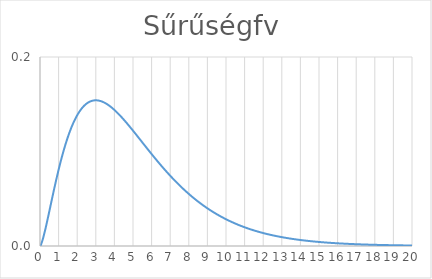
| Category | Series 0 |
|---|---|
| 0.0 | 0 |
| 0.01 | 0 |
| 0.02 | 0 |
| 0.03 | 0.001 |
| 0.04 | 0.001 |
| 0.05 | 0.001 |
| 0.06 | 0.002 |
| 0.07 | 0.002 |
| 0.08 | 0.003 |
| 0.09 | 0.003 |
| 0.1 | 0.004 |
| 0.11 | 0.005 |
| 0.12 | 0.005 |
| 0.13 | 0.006 |
| 0.14 | 0.006 |
| 0.15 | 0.007 |
| 0.16 | 0.008 |
| 0.17 | 0.009 |
| 0.18 | 0.009 |
| 0.19 | 0.01 |
| 0.2 | 0.011 |
| 0.21 | 0.012 |
| 0.22 | 0.012 |
| 0.23 | 0.013 |
| 0.24 | 0.014 |
| 0.25 | 0.015 |
| 0.26 | 0.015 |
| 0.27 | 0.016 |
| 0.28 | 0.017 |
| 0.29 | 0.018 |
| 0.3 | 0.019 |
| 0.31 | 0.02 |
| 0.32 | 0.021 |
| 0.33 | 0.021 |
| 0.34 | 0.022 |
| 0.35 | 0.023 |
| 0.36 | 0.024 |
| 0.37 | 0.025 |
| 0.38 | 0.026 |
| 0.39 | 0.027 |
| 0.4 | 0.028 |
| 0.41 | 0.028 |
| 0.42 | 0.029 |
| 0.43 | 0.03 |
| 0.44 | 0.031 |
| 0.45 | 0.032 |
| 0.46 | 0.033 |
| 0.47 | 0.034 |
| 0.48 | 0.035 |
| 0.49 | 0.036 |
| 0.5 | 0.037 |
| 0.51 | 0.038 |
| 0.52 | 0.038 |
| 0.53 | 0.039 |
| 0.54 | 0.04 |
| 0.55 | 0.041 |
| 0.56 | 0.042 |
| 0.57 | 0.043 |
| 0.58 | 0.044 |
| 0.59 | 0.045 |
| 0.6 | 0.046 |
| 0.61 | 0.047 |
| 0.62 | 0.048 |
| 0.63 | 0.049 |
| 0.64 | 0.049 |
| 0.65 | 0.05 |
| 0.66 | 0.051 |
| 0.67 | 0.052 |
| 0.68 | 0.053 |
| 0.69 | 0.054 |
| 0.7 | 0.055 |
| 0.71 | 0.056 |
| 0.72 | 0.057 |
| 0.73 | 0.058 |
| 0.74 | 0.058 |
| 0.75 | 0.059 |
| 0.76 | 0.06 |
| 0.77 | 0.061 |
| 0.78 | 0.062 |
| 0.79 | 0.063 |
| 0.8 | 0.064 |
| 0.81 | 0.065 |
| 0.82 | 0.066 |
| 0.83 | 0.066 |
| 0.84 | 0.067 |
| 0.85 | 0.068 |
| 0.86 | 0.069 |
| 0.87 | 0.07 |
| 0.88 | 0.071 |
| 0.89 | 0.072 |
| 0.9 | 0.072 |
| 0.91 | 0.073 |
| 0.92 | 0.074 |
| 0.93 | 0.075 |
| 0.94 | 0.076 |
| 0.95 | 0.077 |
| 0.96 | 0.077 |
| 0.97 | 0.078 |
| 0.98 | 0.079 |
| 0.99 | 0.08 |
| 1.0 | 0.081 |
| 1.01 | 0.081 |
| 1.02 | 0.082 |
| 1.03 | 0.083 |
| 1.04 | 0.084 |
| 1.05 | 0.085 |
| 1.06 | 0.085 |
| 1.07 | 0.086 |
| 1.08 | 0.087 |
| 1.09 | 0.088 |
| 1.1 | 0.089 |
| 1.11 | 0.089 |
| 1.12 | 0.09 |
| 1.13 | 0.091 |
| 1.14 | 0.092 |
| 1.15 | 0.092 |
| 1.16 | 0.093 |
| 1.17 | 0.094 |
| 1.18 | 0.094 |
| 1.19 | 0.095 |
| 1.2 | 0.096 |
| 1.21 | 0.097 |
| 1.22 | 0.097 |
| 1.23 | 0.098 |
| 1.24 | 0.099 |
| 1.25 | 0.099 |
| 1.26 | 0.1 |
| 1.27 | 0.101 |
| 1.28 | 0.102 |
| 1.29 | 0.102 |
| 1.3 | 0.103 |
| 1.31 | 0.104 |
| 1.32 | 0.104 |
| 1.33 | 0.105 |
| 1.34 | 0.106 |
| 1.35 | 0.106 |
| 1.36 | 0.107 |
| 1.37 | 0.107 |
| 1.38 | 0.108 |
| 1.39 | 0.109 |
| 1.4 | 0.109 |
| 1.41 | 0.11 |
| 1.42 | 0.111 |
| 1.43 | 0.111 |
| 1.44 | 0.112 |
| 1.45 | 0.112 |
| 1.46 | 0.113 |
| 1.47 | 0.114 |
| 1.48 | 0.114 |
| 1.49 | 0.115 |
| 1.5 | 0.115 |
| 1.51 | 0.116 |
| 1.52 | 0.117 |
| 1.53 | 0.117 |
| 1.54 | 0.118 |
| 1.55 | 0.118 |
| 1.56 | 0.119 |
| 1.57 | 0.119 |
| 1.58 | 0.12 |
| 1.59 | 0.12 |
| 1.6 | 0.121 |
| 1.61 | 0.121 |
| 1.62 | 0.122 |
| 1.63 | 0.122 |
| 1.64 | 0.123 |
| 1.65 | 0.124 |
| 1.66 | 0.124 |
| 1.67 | 0.125 |
| 1.68 | 0.125 |
| 1.69 | 0.125 |
| 1.7 | 0.126 |
| 1.71 | 0.126 |
| 1.72 | 0.127 |
| 1.73 | 0.127 |
| 1.74 | 0.128 |
| 1.75 | 0.128 |
| 1.76 | 0.129 |
| 1.77 | 0.129 |
| 1.78 | 0.13 |
| 1.79 | 0.13 |
| 1.8 | 0.131 |
| 1.81 | 0.131 |
| 1.82 | 0.131 |
| 1.83 | 0.132 |
| 1.84 | 0.132 |
| 1.85 | 0.133 |
| 1.86 | 0.133 |
| 1.87 | 0.134 |
| 1.88 | 0.134 |
| 1.89 | 0.134 |
| 1.9 | 0.135 |
| 1.91 | 0.135 |
| 1.92 | 0.135 |
| 1.93 | 0.136 |
| 1.94 | 0.136 |
| 1.95 | 0.137 |
| 1.96 | 0.137 |
| 1.97 | 0.137 |
| 1.98 | 0.138 |
| 1.99 | 0.138 |
| 2.0 | 0.138 |
| 2.01 | 0.139 |
| 2.02 | 0.139 |
| 2.03 | 0.139 |
| 2.04 | 0.14 |
| 2.05 | 0.14 |
| 2.06 | 0.14 |
| 2.07 | 0.141 |
| 2.08 | 0.141 |
| 2.09 | 0.141 |
| 2.1 | 0.142 |
| 2.11 | 0.142 |
| 2.12 | 0.142 |
| 2.13 | 0.143 |
| 2.14 | 0.143 |
| 2.15 | 0.143 |
| 2.16 | 0.143 |
| 2.17 | 0.144 |
| 2.18 | 0.144 |
| 2.19 | 0.144 |
| 2.2 | 0.144 |
| 2.21 | 0.145 |
| 2.22 | 0.145 |
| 2.23 | 0.145 |
| 2.24 | 0.145 |
| 2.25 | 0.146 |
| 2.26 | 0.146 |
| 2.27 | 0.146 |
| 2.28 | 0.146 |
| 2.29 | 0.147 |
| 2.3 | 0.147 |
| 2.31 | 0.147 |
| 2.32 | 0.147 |
| 2.33 | 0.148 |
| 2.34 | 0.148 |
| 2.35 | 0.148 |
| 2.36 | 0.148 |
| 2.37 | 0.148 |
| 2.38 | 0.149 |
| 2.39 | 0.149 |
| 2.4 | 0.149 |
| 2.41 | 0.149 |
| 2.42 | 0.149 |
| 2.43 | 0.149 |
| 2.44 | 0.15 |
| 2.45 | 0.15 |
| 2.46 | 0.15 |
| 2.47 | 0.15 |
| 2.48 | 0.15 |
| 2.49 | 0.15 |
| 2.5 | 0.151 |
| 2.51 | 0.151 |
| 2.52 | 0.151 |
| 2.53 | 0.151 |
| 2.54 | 0.151 |
| 2.55 | 0.151 |
| 2.56 | 0.151 |
| 2.57 | 0.152 |
| 2.58 | 0.152 |
| 2.59 | 0.152 |
| 2.6 | 0.152 |
| 2.61 | 0.152 |
| 2.62 | 0.152 |
| 2.63 | 0.152 |
| 2.64 | 0.152 |
| 2.65 | 0.152 |
| 2.66 | 0.153 |
| 2.67 | 0.153 |
| 2.68 | 0.153 |
| 2.69 | 0.153 |
| 2.7 | 0.153 |
| 2.71 | 0.153 |
| 2.72 | 0.153 |
| 2.73 | 0.153 |
| 2.74 | 0.153 |
| 2.75 | 0.153 |
| 2.76 | 0.153 |
| 2.77 | 0.153 |
| 2.78 | 0.154 |
| 2.79 | 0.154 |
| 2.8 | 0.154 |
| 2.81 | 0.154 |
| 2.82 | 0.154 |
| 2.83 | 0.154 |
| 2.84 | 0.154 |
| 2.85 | 0.154 |
| 2.86 | 0.154 |
| 2.87 | 0.154 |
| 2.88 | 0.154 |
| 2.89 | 0.154 |
| 2.9 | 0.154 |
| 2.91 | 0.154 |
| 2.92 | 0.154 |
| 2.93 | 0.154 |
| 2.94 | 0.154 |
| 2.95 | 0.154 |
| 2.96 | 0.154 |
| 2.97 | 0.154 |
| 2.98 | 0.154 |
| 2.99 | 0.154 |
| 3.0 | 0.154 |
| 3.01 | 0.154 |
| 3.02 | 0.154 |
| 3.03 | 0.154 |
| 3.04 | 0.154 |
| 3.05 | 0.154 |
| 3.06 | 0.154 |
| 3.07 | 0.154 |
| 3.08 | 0.154 |
| 3.09 | 0.154 |
| 3.1 | 0.154 |
| 3.11 | 0.154 |
| 3.12 | 0.154 |
| 3.13 | 0.154 |
| 3.14 | 0.154 |
| 3.15 | 0.154 |
| 3.16 | 0.154 |
| 3.17 | 0.154 |
| 3.18 | 0.154 |
| 3.19 | 0.154 |
| 3.2 | 0.154 |
| 3.21 | 0.154 |
| 3.22 | 0.154 |
| 3.23 | 0.154 |
| 3.24 | 0.153 |
| 3.25 | 0.153 |
| 3.26 | 0.153 |
| 3.27 | 0.153 |
| 3.28 | 0.153 |
| 3.29 | 0.153 |
| 3.3 | 0.153 |
| 3.31 | 0.153 |
| 3.32 | 0.153 |
| 3.33 | 0.153 |
| 3.34 | 0.153 |
| 3.35 | 0.153 |
| 3.36 | 0.153 |
| 3.37 | 0.153 |
| 3.38 | 0.152 |
| 3.39 | 0.152 |
| 3.4 | 0.152 |
| 3.41 | 0.152 |
| 3.42 | 0.152 |
| 3.43 | 0.152 |
| 3.44 | 0.152 |
| 3.45 | 0.152 |
| 3.46 | 0.152 |
| 3.47 | 0.152 |
| 3.48 | 0.152 |
| 3.49 | 0.151 |
| 3.5 | 0.151 |
| 3.51 | 0.151 |
| 3.52 | 0.151 |
| 3.53 | 0.151 |
| 3.54 | 0.151 |
| 3.55 | 0.151 |
| 3.56 | 0.151 |
| 3.57 | 0.151 |
| 3.58 | 0.15 |
| 3.59 | 0.15 |
| 3.6 | 0.15 |
| 3.61 | 0.15 |
| 3.62 | 0.15 |
| 3.63 | 0.15 |
| 3.64 | 0.15 |
| 3.65 | 0.149 |
| 3.66 | 0.149 |
| 3.67 | 0.149 |
| 3.68 | 0.149 |
| 3.69 | 0.149 |
| 3.7 | 0.149 |
| 3.71 | 0.149 |
| 3.72 | 0.149 |
| 3.73 | 0.148 |
| 3.74 | 0.148 |
| 3.75 | 0.148 |
| 3.76 | 0.148 |
| 3.77 | 0.148 |
| 3.78 | 0.148 |
| 3.79 | 0.147 |
| 3.8 | 0.147 |
| 3.81 | 0.147 |
| 3.82 | 0.147 |
| 3.83 | 0.147 |
| 3.84 | 0.147 |
| 3.85 | 0.147 |
| 3.86 | 0.146 |
| 3.87 | 0.146 |
| 3.88 | 0.146 |
| 3.89 | 0.146 |
| 3.9 | 0.146 |
| 3.91 | 0.146 |
| 3.92 | 0.145 |
| 3.93 | 0.145 |
| 3.94 | 0.145 |
| 3.95 | 0.145 |
| 3.96 | 0.145 |
| 3.97 | 0.145 |
| 3.98 | 0.144 |
| 3.99 | 0.144 |
| 4.0 | 0.144 |
| 4.01 | 0.144 |
| 4.02 | 0.144 |
| 4.03 | 0.143 |
| 4.04 | 0.143 |
| 4.05 | 0.143 |
| 4.06 | 0.143 |
| 4.07 | 0.143 |
| 4.08 | 0.143 |
| 4.09 | 0.142 |
| 4.1 | 0.142 |
| 4.11 | 0.142 |
| 4.12 | 0.142 |
| 4.13 | 0.142 |
| 4.14 | 0.141 |
| 4.15 | 0.141 |
| 4.16 | 0.141 |
| 4.17 | 0.141 |
| 4.18 | 0.141 |
| 4.19 | 0.14 |
| 4.2 | 0.14 |
| 4.21 | 0.14 |
| 4.22 | 0.14 |
| 4.23 | 0.14 |
| 4.24 | 0.139 |
| 4.25 | 0.139 |
| 4.26 | 0.139 |
| 4.27 | 0.139 |
| 4.28 | 0.139 |
| 4.29 | 0.138 |
| 4.3 | 0.138 |
| 4.31 | 0.138 |
| 4.32 | 0.138 |
| 4.33 | 0.137 |
| 4.34 | 0.137 |
| 4.35 | 0.137 |
| 4.36 | 0.137 |
| 4.37 | 0.137 |
| 4.38 | 0.136 |
| 4.39 | 0.136 |
| 4.4 | 0.136 |
| 4.41 | 0.136 |
| 4.42 | 0.136 |
| 4.43 | 0.135 |
| 4.44 | 0.135 |
| 4.45 | 0.135 |
| 4.46 | 0.135 |
| 4.47 | 0.134 |
| 4.48 | 0.134 |
| 4.49 | 0.134 |
| 4.5 | 0.134 |
| 4.51 | 0.134 |
| 4.52 | 0.133 |
| 4.53 | 0.133 |
| 4.54 | 0.133 |
| 4.55 | 0.133 |
| 4.56 | 0.132 |
| 4.57 | 0.132 |
| 4.58 | 0.132 |
| 4.59 | 0.132 |
| 4.6 | 0.132 |
| 4.61 | 0.131 |
| 4.62 | 0.131 |
| 4.63 | 0.131 |
| 4.64 | 0.131 |
| 4.65 | 0.13 |
| 4.66 | 0.13 |
| 4.67 | 0.13 |
| 4.68 | 0.13 |
| 4.69 | 0.129 |
| 4.7 | 0.129 |
| 4.71 | 0.129 |
| 4.72 | 0.129 |
| 4.73 | 0.129 |
| 4.74 | 0.128 |
| 4.75 | 0.128 |
| 4.76 | 0.128 |
| 4.77 | 0.128 |
| 4.78 | 0.127 |
| 4.79 | 0.127 |
| 4.8 | 0.127 |
| 4.81 | 0.127 |
| 4.82 | 0.126 |
| 4.83 | 0.126 |
| 4.84 | 0.126 |
| 4.85 | 0.126 |
| 4.86 | 0.125 |
| 4.87 | 0.125 |
| 4.88 | 0.125 |
| 4.89 | 0.125 |
| 4.9 | 0.124 |
| 4.91 | 0.124 |
| 4.92 | 0.124 |
| 4.93 | 0.124 |
| 4.94 | 0.124 |
| 4.95 | 0.123 |
| 4.96 | 0.123 |
| 4.97 | 0.123 |
| 4.98 | 0.123 |
| 4.99 | 0.122 |
| 5.0 | 0.122 |
| 5.01 | 0.122 |
| 5.02 | 0.122 |
| 5.03 | 0.121 |
| 5.04 | 0.121 |
| 5.05 | 0.121 |
| 5.06 | 0.121 |
| 5.07 | 0.12 |
| 5.08 | 0.12 |
| 5.09 | 0.12 |
| 5.1 | 0.12 |
| 5.11 | 0.119 |
| 5.12 | 0.119 |
| 5.13 | 0.119 |
| 5.14 | 0.119 |
| 5.15 | 0.118 |
| 5.16 | 0.118 |
| 5.17 | 0.118 |
| 5.18 | 0.118 |
| 5.19 | 0.117 |
| 5.2 | 0.117 |
| 5.21 | 0.117 |
| 5.22 | 0.117 |
| 5.23 | 0.116 |
| 5.24 | 0.116 |
| 5.25 | 0.116 |
| 5.26 | 0.116 |
| 5.27 | 0.115 |
| 5.28 | 0.115 |
| 5.29 | 0.115 |
| 5.3 | 0.115 |
| 5.31 | 0.114 |
| 5.32 | 0.114 |
| 5.33 | 0.114 |
| 5.34 | 0.114 |
| 5.35 | 0.113 |
| 5.36 | 0.113 |
| 5.37 | 0.113 |
| 5.38 | 0.113 |
| 5.39 | 0.112 |
| 5.4 | 0.112 |
| 5.41 | 0.112 |
| 5.42 | 0.112 |
| 5.43 | 0.111 |
| 5.44 | 0.111 |
| 5.45 | 0.111 |
| 5.46 | 0.111 |
| 5.47 | 0.11 |
| 5.48 | 0.11 |
| 5.49 | 0.11 |
| 5.5 | 0.11 |
| 5.51 | 0.109 |
| 5.52 | 0.109 |
| 5.53 | 0.109 |
| 5.54 | 0.109 |
| 5.55 | 0.108 |
| 5.56 | 0.108 |
| 5.57 | 0.108 |
| 5.58 | 0.108 |
| 5.59 | 0.107 |
| 5.6 | 0.107 |
| 5.61 | 0.107 |
| 5.62 | 0.107 |
| 5.63 | 0.106 |
| 5.64 | 0.106 |
| 5.65 | 0.106 |
| 5.66 | 0.106 |
| 5.67 | 0.105 |
| 5.68 | 0.105 |
| 5.69 | 0.105 |
| 5.7 | 0.105 |
| 5.71 | 0.104 |
| 5.72 | 0.104 |
| 5.73 | 0.104 |
| 5.74 | 0.104 |
| 5.75 | 0.103 |
| 5.76 | 0.103 |
| 5.77 | 0.103 |
| 5.78 | 0.103 |
| 5.79 | 0.102 |
| 5.8 | 0.102 |
| 5.81 | 0.102 |
| 5.82 | 0.102 |
| 5.83 | 0.101 |
| 5.84 | 0.101 |
| 5.85 | 0.101 |
| 5.86 | 0.101 |
| 5.87 | 0.1 |
| 5.88 | 0.1 |
| 5.89 | 0.1 |
| 5.9 | 0.1 |
| 5.91 | 0.1 |
| 5.92 | 0.099 |
| 5.93 | 0.099 |
| 5.94 | 0.099 |
| 5.95 | 0.099 |
| 5.96 | 0.098 |
| 5.97 | 0.098 |
| 5.98 | 0.098 |
| 5.99 | 0.098 |
| 6.0 | 0.097 |
| 6.01 | 0.097 |
| 6.02 | 0.097 |
| 6.03 | 0.097 |
| 6.04 | 0.096 |
| 6.05 | 0.096 |
| 6.06 | 0.096 |
| 6.07 | 0.096 |
| 6.08 | 0.095 |
| 6.09 | 0.095 |
| 6.1 | 0.095 |
| 6.11 | 0.095 |
| 6.12 | 0.094 |
| 6.13 | 0.094 |
| 6.14 | 0.094 |
| 6.15 | 0.094 |
| 6.16 | 0.093 |
| 6.17 | 0.093 |
| 6.18 | 0.093 |
| 6.19 | 0.093 |
| 6.2 | 0.092 |
| 6.21 | 0.092 |
| 6.22 | 0.092 |
| 6.23 | 0.092 |
| 6.24 | 0.092 |
| 6.25 | 0.091 |
| 6.26 | 0.091 |
| 6.27 | 0.091 |
| 6.28 | 0.091 |
| 6.29 | 0.09 |
| 6.3 | 0.09 |
| 6.31 | 0.09 |
| 6.32 | 0.09 |
| 6.33 | 0.089 |
| 6.34 | 0.089 |
| 6.35 | 0.089 |
| 6.36 | 0.089 |
| 6.37 | 0.088 |
| 6.38 | 0.088 |
| 6.39 | 0.088 |
| 6.4 | 0.088 |
| 6.41 | 0.088 |
| 6.42 | 0.087 |
| 6.43 | 0.087 |
| 6.44 | 0.087 |
| 6.45 | 0.087 |
| 6.46 | 0.086 |
| 6.47 | 0.086 |
| 6.48 | 0.086 |
| 6.49 | 0.086 |
| 6.5 | 0.085 |
| 6.51 | 0.085 |
| 6.52 | 0.085 |
| 6.53 | 0.085 |
| 6.54 | 0.085 |
| 6.55 | 0.084 |
| 6.56 | 0.084 |
| 6.57 | 0.084 |
| 6.58 | 0.084 |
| 6.59 | 0.083 |
| 6.6 | 0.083 |
| 6.61 | 0.083 |
| 6.62 | 0.083 |
| 6.63 | 0.082 |
| 6.64 | 0.082 |
| 6.65 | 0.082 |
| 6.66 | 0.082 |
| 6.67 | 0.082 |
| 6.68 | 0.081 |
| 6.69 | 0.081 |
| 6.7 | 0.081 |
| 6.71 | 0.081 |
| 6.72 | 0.08 |
| 6.73 | 0.08 |
| 6.74 | 0.08 |
| 6.75 | 0.08 |
| 6.76 | 0.08 |
| 6.77 | 0.079 |
| 6.78 | 0.079 |
| 6.79 | 0.079 |
| 6.8 | 0.079 |
| 6.81 | 0.078 |
| 6.82 | 0.078 |
| 6.83 | 0.078 |
| 6.84 | 0.078 |
| 6.85 | 0.078 |
| 6.86 | 0.077 |
| 6.87 | 0.077 |
| 6.88 | 0.077 |
| 6.89 | 0.077 |
| 6.9 | 0.077 |
| 6.91 | 0.076 |
| 6.92 | 0.076 |
| 6.93 | 0.076 |
| 6.94 | 0.076 |
| 6.95 | 0.075 |
| 6.96 | 0.075 |
| 6.97 | 0.075 |
| 6.98 | 0.075 |
| 6.99 | 0.075 |
| 7.0 | 0.074 |
| 7.01 | 0.074 |
| 7.02 | 0.074 |
| 7.03 | 0.074 |
| 7.04 | 0.074 |
| 7.05 | 0.073 |
| 7.06 | 0.073 |
| 7.07 | 0.073 |
| 7.08 | 0.073 |
| 7.09 | 0.072 |
| 7.1 | 0.072 |
| 7.11 | 0.072 |
| 7.12 | 0.072 |
| 7.13 | 0.072 |
| 7.14 | 0.071 |
| 7.15 | 0.071 |
| 7.16 | 0.071 |
| 7.17 | 0.071 |
| 7.18 | 0.071 |
| 7.19 | 0.07 |
| 7.2 | 0.07 |
| 7.21 | 0.07 |
| 7.22 | 0.07 |
| 7.23 | 0.07 |
| 7.24 | 0.069 |
| 7.25 | 0.069 |
| 7.26 | 0.069 |
| 7.27 | 0.069 |
| 7.28 | 0.069 |
| 7.29 | 0.068 |
| 7.3 | 0.068 |
| 7.31 | 0.068 |
| 7.32 | 0.068 |
| 7.33 | 0.068 |
| 7.34 | 0.067 |
| 7.35 | 0.067 |
| 7.36 | 0.067 |
| 7.37 | 0.067 |
| 7.38 | 0.067 |
| 7.39 | 0.066 |
| 7.4 | 0.066 |
| 7.41 | 0.066 |
| 7.42 | 0.066 |
| 7.43 | 0.066 |
| 7.44 | 0.065 |
| 7.45 | 0.065 |
| 7.46 | 0.065 |
| 7.47 | 0.065 |
| 7.48 | 0.065 |
| 7.49 | 0.064 |
| 7.5 | 0.064 |
| 7.51 | 0.064 |
| 7.52 | 0.064 |
| 7.53 | 0.064 |
| 7.54 | 0.063 |
| 7.55 | 0.063 |
| 7.56 | 0.063 |
| 7.57 | 0.063 |
| 7.58 | 0.063 |
| 7.59 | 0.063 |
| 7.6 | 0.062 |
| 7.61 | 0.062 |
| 7.62 | 0.062 |
| 7.63 | 0.062 |
| 7.64 | 0.062 |
| 7.65 | 0.061 |
| 7.66 | 0.061 |
| 7.67 | 0.061 |
| 7.68 | 0.061 |
| 7.69 | 0.061 |
| 7.7 | 0.06 |
| 7.71 | 0.06 |
| 7.72 | 0.06 |
| 7.73 | 0.06 |
| 7.74 | 0.06 |
| 7.75 | 0.06 |
| 7.76 | 0.059 |
| 7.77 | 0.059 |
| 7.78 | 0.059 |
| 7.79 | 0.059 |
| 7.8 | 0.059 |
| 7.81 | 0.058 |
| 7.82 | 0.058 |
| 7.83 | 0.058 |
| 7.84 | 0.058 |
| 7.85 | 0.058 |
| 7.86 | 0.058 |
| 7.87 | 0.057 |
| 7.88 | 0.057 |
| 7.89 | 0.057 |
| 7.9 | 0.057 |
| 7.91 | 0.057 |
| 7.92 | 0.057 |
| 7.93 | 0.056 |
| 7.94 | 0.056 |
| 7.95 | 0.056 |
| 7.96 | 0.056 |
| 7.97 | 0.056 |
| 7.98 | 0.055 |
| 7.99 | 0.055 |
| 8.0 | 0.055 |
| 8.01 | 0.055 |
| 8.02 | 0.055 |
| 8.03 | 0.055 |
| 8.04 | 0.054 |
| 8.05 | 0.054 |
| 8.06 | 0.054 |
| 8.07 | 0.054 |
| 8.08 | 0.054 |
| 8.09 | 0.054 |
| 8.1 | 0.053 |
| 8.11 | 0.053 |
| 8.12 | 0.053 |
| 8.13 | 0.053 |
| 8.14 | 0.053 |
| 8.15 | 0.053 |
| 8.16 | 0.052 |
| 8.17 | 0.052 |
| 8.18 | 0.052 |
| 8.19 | 0.052 |
| 8.2 | 0.052 |
| 8.21 | 0.052 |
| 8.22 | 0.051 |
| 8.23 | 0.051 |
| 8.24 | 0.051 |
| 8.25 | 0.051 |
| 8.26 | 0.051 |
| 8.27 | 0.051 |
| 8.28 | 0.05 |
| 8.29 | 0.05 |
| 8.3 | 0.05 |
| 8.31 | 0.05 |
| 8.32 | 0.05 |
| 8.33 | 0.05 |
| 8.34 | 0.049 |
| 8.35 | 0.049 |
| 8.36 | 0.049 |
| 8.37 | 0.049 |
| 8.38 | 0.049 |
| 8.39 | 0.049 |
| 8.4 | 0.049 |
| 8.41 | 0.048 |
| 8.42 | 0.048 |
| 8.43 | 0.048 |
| 8.44 | 0.048 |
| 8.45 | 0.048 |
| 8.46 | 0.048 |
| 8.47 | 0.047 |
| 8.48 | 0.047 |
| 8.49 | 0.047 |
| 8.5 | 0.047 |
| 8.51 | 0.047 |
| 8.52 | 0.047 |
| 8.53 | 0.047 |
| 8.54 | 0.046 |
| 8.55 | 0.046 |
| 8.56 | 0.046 |
| 8.57 | 0.046 |
| 8.58 | 0.046 |
| 8.59 | 0.046 |
| 8.6 | 0.046 |
| 8.61 | 0.045 |
| 8.62 | 0.045 |
| 8.63 | 0.045 |
| 8.64 | 0.045 |
| 8.65 | 0.045 |
| 8.66 | 0.045 |
| 8.67 | 0.044 |
| 8.68 | 0.044 |
| 8.69 | 0.044 |
| 8.7 | 0.044 |
| 8.71 | 0.044 |
| 8.72 | 0.044 |
| 8.73 | 0.044 |
| 8.74 | 0.043 |
| 8.75 | 0.043 |
| 8.76 | 0.043 |
| 8.77 | 0.043 |
| 8.78 | 0.043 |
| 8.79 | 0.043 |
| 8.8 | 0.043 |
| 8.81 | 0.042 |
| 8.82 | 0.042 |
| 8.83 | 0.042 |
| 8.84 | 0.042 |
| 8.85 | 0.042 |
| 8.86 | 0.042 |
| 8.87 | 0.042 |
| 8.88 | 0.042 |
| 8.89 | 0.041 |
| 8.9 | 0.041 |
| 8.91 | 0.041 |
| 8.92 | 0.041 |
| 8.93 | 0.041 |
| 8.94 | 0.041 |
| 8.95 | 0.041 |
| 8.96 | 0.04 |
| 8.97 | 0.04 |
| 8.98 | 0.04 |
| 8.99 | 0.04 |
| 9.0 | 0.04 |
| 9.01 | 0.04 |
| 9.02 | 0.04 |
| 9.03 | 0.039 |
| 9.04 | 0.039 |
| 9.05 | 0.039 |
| 9.06 | 0.039 |
| 9.07 | 0.039 |
| 9.08 | 0.039 |
| 9.09 | 0.039 |
| 9.1 | 0.039 |
| 9.11 | 0.038 |
| 9.12 | 0.038 |
| 9.13 | 0.038 |
| 9.14 | 0.038 |
| 9.15 | 0.038 |
| 9.16 | 0.038 |
| 9.17 | 0.038 |
| 9.18 | 0.038 |
| 9.19 | 0.037 |
| 9.2 | 0.037 |
| 9.21 | 0.037 |
| 9.22 | 0.037 |
| 9.23 | 0.037 |
| 9.24 | 0.037 |
| 9.25 | 0.037 |
| 9.26 | 0.037 |
| 9.27 | 0.036 |
| 9.28 | 0.036 |
| 9.29 | 0.036 |
| 9.3 | 0.036 |
| 9.31 | 0.036 |
| 9.32 | 0.036 |
| 9.33 | 0.036 |
| 9.34 | 0.036 |
| 9.35 | 0.035 |
| 9.36 | 0.035 |
| 9.37 | 0.035 |
| 9.38 | 0.035 |
| 9.39 | 0.035 |
| 9.4 | 0.035 |
| 9.41 | 0.035 |
| 9.42 | 0.035 |
| 9.43 | 0.035 |
| 9.44 | 0.034 |
| 9.45 | 0.034 |
| 9.46 | 0.034 |
| 9.47 | 0.034 |
| 9.48 | 0.034 |
| 9.49 | 0.034 |
| 9.5 | 0.034 |
| 9.51 | 0.034 |
| 9.52 | 0.033 |
| 9.53 | 0.033 |
| 9.54 | 0.033 |
| 9.55 | 0.033 |
| 9.56 | 0.033 |
| 9.57 | 0.033 |
| 9.58 | 0.033 |
| 9.59 | 0.033 |
| 9.6 | 0.033 |
| 9.61 | 0.032 |
| 9.62 | 0.032 |
| 9.63 | 0.032 |
| 9.64 | 0.032 |
| 9.65 | 0.032 |
| 9.66 | 0.032 |
| 9.67 | 0.032 |
| 9.68 | 0.032 |
| 9.69 | 0.032 |
| 9.7 | 0.031 |
| 9.71 | 0.031 |
| 9.72 | 0.031 |
| 9.73 | 0.031 |
| 9.74 | 0.031 |
| 9.75 | 0.031 |
| 9.76 | 0.031 |
| 9.77 | 0.031 |
| 9.78 | 0.031 |
| 9.79 | 0.03 |
| 9.8 | 0.03 |
| 9.81 | 0.03 |
| 9.82 | 0.03 |
| 9.83 | 0.03 |
| 9.84 | 0.03 |
| 9.85 | 0.03 |
| 9.86 | 0.03 |
| 9.87 | 0.03 |
| 9.88 | 0.03 |
| 9.89 | 0.029 |
| 9.9 | 0.029 |
| 9.91 | 0.029 |
| 9.92 | 0.029 |
| 9.93 | 0.029 |
| 9.94 | 0.029 |
| 9.95 | 0.029 |
| 9.96 | 0.029 |
| 9.97 | 0.029 |
| 9.98 | 0.029 |
| 9.99 | 0.028 |
| 10.0 | 0.028 |
| 10.01 | 0.028 |
| 10.02 | 0.028 |
| 10.03 | 0.028 |
| 10.04 | 0.028 |
| 10.05 | 0.028 |
| 10.06 | 0.028 |
| 10.07 | 0.028 |
| 10.08 | 0.028 |
| 10.09 | 0.027 |
| 10.1 | 0.027 |
| 10.11 | 0.027 |
| 10.12 | 0.027 |
| 10.13 | 0.027 |
| 10.14 | 0.027 |
| 10.15 | 0.027 |
| 10.16 | 0.027 |
| 10.17 | 0.027 |
| 10.18 | 0.027 |
| 10.19 | 0.027 |
| 10.2 | 0.026 |
| 10.21 | 0.026 |
| 10.22 | 0.026 |
| 10.23 | 0.026 |
| 10.24 | 0.026 |
| 10.25 | 0.026 |
| 10.26 | 0.026 |
| 10.27 | 0.026 |
| 10.28 | 0.026 |
| 10.29 | 0.026 |
| 10.3 | 0.025 |
| 10.31 | 0.025 |
| 10.32 | 0.025 |
| 10.33 | 0.025 |
| 10.34 | 0.025 |
| 10.35 | 0.025 |
| 10.36 | 0.025 |
| 10.37 | 0.025 |
| 10.38 | 0.025 |
| 10.39 | 0.025 |
| 10.4 | 0.025 |
| 10.41 | 0.025 |
| 10.42 | 0.024 |
| 10.43 | 0.024 |
| 10.44 | 0.024 |
| 10.45 | 0.024 |
| 10.46 | 0.024 |
| 10.47 | 0.024 |
| 10.48 | 0.024 |
| 10.49 | 0.024 |
| 10.5 | 0.024 |
| 10.51 | 0.024 |
| 10.52 | 0.024 |
| 10.53 | 0.023 |
| 10.54 | 0.023 |
| 10.55 | 0.023 |
| 10.56 | 0.023 |
| 10.57 | 0.023 |
| 10.58 | 0.023 |
| 10.59 | 0.023 |
| 10.6 | 0.023 |
| 10.61 | 0.023 |
| 10.62 | 0.023 |
| 10.63 | 0.023 |
| 10.64 | 0.023 |
| 10.65 | 0.023 |
| 10.66 | 0.022 |
| 10.67 | 0.022 |
| 10.68 | 0.022 |
| 10.69 | 0.022 |
| 10.7 | 0.022 |
| 10.71 | 0.022 |
| 10.72 | 0.022 |
| 10.73 | 0.022 |
| 10.74 | 0.022 |
| 10.75 | 0.022 |
| 10.76 | 0.022 |
| 10.77 | 0.022 |
| 10.78 | 0.021 |
| 10.79 | 0.021 |
| 10.8 | 0.021 |
| 10.81 | 0.021 |
| 10.82 | 0.021 |
| 10.83 | 0.021 |
| 10.84 | 0.021 |
| 10.85 | 0.021 |
| 10.86 | 0.021 |
| 10.87 | 0.021 |
| 10.88 | 0.021 |
| 10.89 | 0.021 |
| 10.9 | 0.021 |
| 10.91 | 0.02 |
| 10.92 | 0.02 |
| 10.93 | 0.02 |
| 10.94 | 0.02 |
| 10.95 | 0.02 |
| 10.96 | 0.02 |
| 10.97 | 0.02 |
| 10.98 | 0.02 |
| 10.99 | 0.02 |
| 11.0 | 0.02 |
| 11.01 | 0.02 |
| 11.02 | 0.02 |
| 11.03 | 0.02 |
| 11.04 | 0.02 |
| 11.05 | 0.019 |
| 11.06 | 0.019 |
| 11.07 | 0.019 |
| 11.08 | 0.019 |
| 11.09 | 0.019 |
| 11.1 | 0.019 |
| 11.11 | 0.019 |
| 11.12 | 0.019 |
| 11.13 | 0.019 |
| 11.14 | 0.019 |
| 11.15 | 0.019 |
| 11.16 | 0.019 |
| 11.17 | 0.019 |
| 11.18 | 0.019 |
| 11.19 | 0.018 |
| 11.2 | 0.018 |
| 11.21 | 0.018 |
| 11.22 | 0.018 |
| 11.23 | 0.018 |
| 11.24 | 0.018 |
| 11.25 | 0.018 |
| 11.26 | 0.018 |
| 11.27 | 0.018 |
| 11.28 | 0.018 |
| 11.29 | 0.018 |
| 11.3 | 0.018 |
| 11.31 | 0.018 |
| 11.32 | 0.018 |
| 11.33 | 0.018 |
| 11.34 | 0.018 |
| 11.35 | 0.017 |
| 11.36 | 0.017 |
| 11.37 | 0.017 |
| 11.38 | 0.017 |
| 11.39 | 0.017 |
| 11.4 | 0.017 |
| 11.41 | 0.017 |
| 11.42 | 0.017 |
| 11.43 | 0.017 |
| 11.44 | 0.017 |
| 11.45 | 0.017 |
| 11.46 | 0.017 |
| 11.47 | 0.017 |
| 11.48 | 0.017 |
| 11.49 | 0.017 |
| 11.5 | 0.017 |
| 11.51 | 0.016 |
| 11.52 | 0.016 |
| 11.53 | 0.016 |
| 11.54 | 0.016 |
| 11.55 | 0.016 |
| 11.56 | 0.016 |
| 11.57 | 0.016 |
| 11.58 | 0.016 |
| 11.59 | 0.016 |
| 11.6 | 0.016 |
| 11.61 | 0.016 |
| 11.62 | 0.016 |
| 11.63 | 0.016 |
| 11.64 | 0.016 |
| 11.65 | 0.016 |
| 11.66 | 0.016 |
| 11.67 | 0.015 |
| 11.68 | 0.015 |
| 11.69 | 0.015 |
| 11.7 | 0.015 |
| 11.71 | 0.015 |
| 11.72 | 0.015 |
| 11.73 | 0.015 |
| 11.74 | 0.015 |
| 11.75 | 0.015 |
| 11.76 | 0.015 |
| 11.77 | 0.015 |
| 11.78 | 0.015 |
| 11.79 | 0.015 |
| 11.8 | 0.015 |
| 11.81 | 0.015 |
| 11.82 | 0.015 |
| 11.83 | 0.015 |
| 11.84 | 0.015 |
| 11.85 | 0.014 |
| 11.86 | 0.014 |
| 11.87 | 0.014 |
| 11.88 | 0.014 |
| 11.89 | 0.014 |
| 11.9 | 0.014 |
| 11.91 | 0.014 |
| 11.92 | 0.014 |
| 11.93 | 0.014 |
| 11.94 | 0.014 |
| 11.95 | 0.014 |
| 11.96 | 0.014 |
| 11.97 | 0.014 |
| 11.98 | 0.014 |
| 11.99 | 0.014 |
| 12.0 | 0.014 |
| 12.01 | 0.014 |
| 12.02 | 0.014 |
| 12.03 | 0.014 |
| 12.04 | 0.013 |
| 12.05 | 0.013 |
| 12.06 | 0.013 |
| 12.07 | 0.013 |
| 12.08 | 0.013 |
| 12.09 | 0.013 |
| 12.0999999999999 | 0.013 |
| 12.1099999999999 | 0.013 |
| 12.12 | 0.013 |
| 12.13 | 0.013 |
| 12.14 | 0.013 |
| 12.15 | 0.013 |
| 12.16 | 0.013 |
| 12.17 | 0.013 |
| 12.1799999999999 | 0.013 |
| 12.1899999999999 | 0.013 |
| 12.1999999999999 | 0.013 |
| 12.21 | 0.013 |
| 12.22 | 0.013 |
| 12.23 | 0.013 |
| 12.24 | 0.013 |
| 12.25 | 0.012 |
| 12.26 | 0.012 |
| 12.2699999999999 | 0.012 |
| 12.28 | 0.012 |
| 12.2899999999999 | 0.012 |
| 12.3 | 0.012 |
| 12.31 | 0.012 |
| 12.32 | 0.012 |
| 12.33 | 0.012 |
| 12.34 | 0.012 |
| 12.3499999999999 | 0.012 |
| 12.3599999999999 | 0.012 |
| 12.37 | 0.012 |
| 12.38 | 0.012 |
| 12.39 | 0.012 |
| 12.4 | 0.012 |
| 12.41 | 0.012 |
| 12.42 | 0.012 |
| 12.4299999999999 | 0.012 |
| 12.4399999999999 | 0.012 |
| 12.4499999999999 | 0.012 |
| 12.46 | 0.012 |
| 12.47 | 0.011 |
| 12.48 | 0.011 |
| 12.49 | 0.011 |
| 12.5 | 0.011 |
| 12.51 | 0.011 |
| 12.5199999999999 | 0.011 |
| 12.53 | 0.011 |
| 12.5399999999999 | 0.011 |
| 12.55 | 0.011 |
| 12.56 | 0.011 |
| 12.5699999999999 | 0.011 |
| 12.5799999999999 | 0.011 |
| 12.5899999999999 | 0.011 |
| 12.5999999999999 | 0.011 |
| 12.6099999999999 | 0.011 |
| 12.6199999999999 | 0.011 |
| 12.6299999999999 | 0.011 |
| 12.6399999999999 | 0.011 |
| 12.6499999999999 | 0.011 |
| 12.6599999999999 | 0.011 |
| 12.6699999999999 | 0.011 |
| 12.6799999999999 | 0.011 |
| 12.6899999999999 | 0.011 |
| 12.6999999999999 | 0.011 |
| 12.7099999999999 | 0.01 |
| 12.7199999999999 | 0.01 |
| 12.7299999999999 | 0.01 |
| 12.7399999999999 | 0.01 |
| 12.7499999999999 | 0.01 |
| 12.7599999999999 | 0.01 |
| 12.7699999999999 | 0.01 |
| 12.7799999999999 | 0.01 |
| 12.7899999999999 | 0.01 |
| 12.7999999999999 | 0.01 |
| 12.8099999999999 | 0.01 |
| 12.8199999999999 | 0.01 |
| 12.8299999999999 | 0.01 |
| 12.8399999999999 | 0.01 |
| 12.8499999999999 | 0.01 |
| 12.8599999999999 | 0.01 |
| 12.8699999999999 | 0.01 |
| 12.8799999999999 | 0.01 |
| 12.8899999999999 | 0.01 |
| 12.8999999999999 | 0.01 |
| 12.9099999999999 | 0.01 |
| 12.9199999999999 | 0.01 |
| 12.9299999999999 | 0.01 |
| 12.9399999999999 | 0.01 |
| 12.9499999999999 | 0.01 |
| 12.9599999999999 | 0.01 |
| 12.9699999999999 | 0.009 |
| 12.9799999999999 | 0.009 |
| 12.9899999999999 | 0.009 |
| 12.9999999999999 | 0.009 |
| 13.0099999999999 | 0.009 |
| 13.0199999999999 | 0.009 |
| 13.0299999999999 | 0.009 |
| 13.0399999999999 | 0.009 |
| 13.0499999999999 | 0.009 |
| 13.0599999999999 | 0.009 |
| 13.0699999999999 | 0.009 |
| 13.0799999999999 | 0.009 |
| 13.0899999999999 | 0.009 |
| 13.0999999999999 | 0.009 |
| 13.1099999999999 | 0.009 |
| 13.1199999999999 | 0.009 |
| 13.1299999999999 | 0.009 |
| 13.1399999999999 | 0.009 |
| 13.1499999999999 | 0.009 |
| 13.1599999999999 | 0.009 |
| 13.1699999999999 | 0.009 |
| 13.1799999999999 | 0.009 |
| 13.1899999999999 | 0.009 |
| 13.1999999999999 | 0.009 |
| 13.2099999999999 | 0.009 |
| 13.2199999999999 | 0.009 |
| 13.2299999999999 | 0.009 |
| 13.2399999999999 | 0.009 |
| 13.2499999999999 | 0.009 |
| 13.2599999999999 | 0.008 |
| 13.2699999999999 | 0.008 |
| 13.2799999999999 | 0.008 |
| 13.2899999999999 | 0.008 |
| 13.2999999999999 | 0.008 |
| 13.3099999999999 | 0.008 |
| 13.3199999999999 | 0.008 |
| 13.3299999999999 | 0.008 |
| 13.3399999999999 | 0.008 |
| 13.3499999999999 | 0.008 |
| 13.3599999999999 | 0.008 |
| 13.3699999999999 | 0.008 |
| 13.3799999999999 | 0.008 |
| 13.3899999999999 | 0.008 |
| 13.3999999999999 | 0.008 |
| 13.4099999999999 | 0.008 |
| 13.4199999999999 | 0.008 |
| 13.4299999999999 | 0.008 |
| 13.4399999999999 | 0.008 |
| 13.4499999999999 | 0.008 |
| 13.4599999999999 | 0.008 |
| 13.4699999999999 | 0.008 |
| 13.4799999999999 | 0.008 |
| 13.4899999999999 | 0.008 |
| 13.4999999999999 | 0.008 |
| 13.5099999999999 | 0.008 |
| 13.5199999999999 | 0.008 |
| 13.5299999999999 | 0.008 |
| 13.5399999999999 | 0.008 |
| 13.5499999999999 | 0.008 |
| 13.5599999999999 | 0.008 |
| 13.5699999999999 | 0.008 |
| 13.5799999999999 | 0.007 |
| 13.5899999999999 | 0.007 |
| 13.5999999999999 | 0.007 |
| 13.6099999999999 | 0.007 |
| 13.6199999999999 | 0.007 |
| 13.6299999999999 | 0.007 |
| 13.6399999999999 | 0.007 |
| 13.6499999999999 | 0.007 |
| 13.6599999999999 | 0.007 |
| 13.6699999999999 | 0.007 |
| 13.6799999999999 | 0.007 |
| 13.6899999999999 | 0.007 |
| 13.6999999999999 | 0.007 |
| 13.7099999999999 | 0.007 |
| 13.7199999999999 | 0.007 |
| 13.7299999999999 | 0.007 |
| 13.7399999999999 | 0.007 |
| 13.7499999999999 | 0.007 |
| 13.7599999999999 | 0.007 |
| 13.7699999999999 | 0.007 |
| 13.7799999999999 | 0.007 |
| 13.7899999999999 | 0.007 |
| 13.7999999999999 | 0.007 |
| 13.8099999999999 | 0.007 |
| 13.8199999999999 | 0.007 |
| 13.8299999999999 | 0.007 |
| 13.8399999999999 | 0.007 |
| 13.8499999999999 | 0.007 |
| 13.8599999999999 | 0.007 |
| 13.8699999999999 | 0.007 |
| 13.8799999999999 | 0.007 |
| 13.8899999999999 | 0.007 |
| 13.8999999999999 | 0.007 |
| 13.9099999999999 | 0.007 |
| 13.9199999999999 | 0.007 |
| 13.9299999999999 | 0.007 |
| 13.9399999999999 | 0.007 |
| 13.9499999999999 | 0.006 |
| 13.9599999999999 | 0.006 |
| 13.9699999999999 | 0.006 |
| 13.9799999999999 | 0.006 |
| 13.9899999999999 | 0.006 |
| 13.9999999999999 | 0.006 |
| 14.0099999999999 | 0.006 |
| 14.0199999999999 | 0.006 |
| 14.0299999999999 | 0.006 |
| 14.0399999999999 | 0.006 |
| 14.0499999999999 | 0.006 |
| 14.0599999999999 | 0.006 |
| 14.0699999999999 | 0.006 |
| 14.0799999999999 | 0.006 |
| 14.0899999999999 | 0.006 |
| 14.0999999999999 | 0.006 |
| 14.1099999999999 | 0.006 |
| 14.1199999999999 | 0.006 |
| 14.1299999999999 | 0.006 |
| 14.1399999999999 | 0.006 |
| 14.1499999999999 | 0.006 |
| 14.1599999999999 | 0.006 |
| 14.1699999999999 | 0.006 |
| 14.1799999999999 | 0.006 |
| 14.1899999999999 | 0.006 |
| 14.1999999999999 | 0.006 |
| 14.2099999999999 | 0.006 |
| 14.2199999999999 | 0.006 |
| 14.2299999999999 | 0.006 |
| 14.2399999999999 | 0.006 |
| 14.2499999999999 | 0.006 |
| 14.2599999999999 | 0.006 |
| 14.2699999999999 | 0.006 |
| 14.2799999999999 | 0.006 |
| 14.2899999999999 | 0.006 |
| 14.2999999999999 | 0.006 |
| 14.3099999999999 | 0.006 |
| 14.3199999999999 | 0.006 |
| 14.3299999999999 | 0.006 |
| 14.3399999999999 | 0.006 |
| 14.3499999999999 | 0.006 |
| 14.3599999999999 | 0.006 |
| 14.3699999999999 | 0.005 |
| 14.3799999999999 | 0.005 |
| 14.3899999999999 | 0.005 |
| 14.3999999999999 | 0.005 |
| 14.4099999999999 | 0.005 |
| 14.4199999999999 | 0.005 |
| 14.4299999999999 | 0.005 |
| 14.4399999999999 | 0.005 |
| 14.4499999999999 | 0.005 |
| 14.4599999999999 | 0.005 |
| 14.4699999999999 | 0.005 |
| 14.4799999999999 | 0.005 |
| 14.4899999999999 | 0.005 |
| 14.4999999999999 | 0.005 |
| 14.5099999999999 | 0.005 |
| 14.5199999999999 | 0.005 |
| 14.5299999999999 | 0.005 |
| 14.5399999999999 | 0.005 |
| 14.5499999999999 | 0.005 |
| 14.5599999999999 | 0.005 |
| 14.5699999999999 | 0.005 |
| 14.5799999999999 | 0.005 |
| 14.5899999999999 | 0.005 |
| 14.5999999999999 | 0.005 |
| 14.6099999999999 | 0.005 |
| 14.6199999999999 | 0.005 |
| 14.6299999999999 | 0.005 |
| 14.6399999999999 | 0.005 |
| 14.6499999999999 | 0.005 |
| 14.6599999999999 | 0.005 |
| 14.6699999999999 | 0.005 |
| 14.6799999999999 | 0.005 |
| 14.6899999999999 | 0.005 |
| 14.6999999999999 | 0.005 |
| 14.7099999999999 | 0.005 |
| 14.7199999999999 | 0.005 |
| 14.7299999999999 | 0.005 |
| 14.7399999999999 | 0.005 |
| 14.7499999999999 | 0.005 |
| 14.7599999999999 | 0.005 |
| 14.7699999999999 | 0.005 |
| 14.7799999999999 | 0.005 |
| 14.7899999999999 | 0.005 |
| 14.7999999999999 | 0.005 |
| 14.8099999999999 | 0.005 |
| 14.8199999999999 | 0.005 |
| 14.8299999999999 | 0.005 |
| 14.8399999999999 | 0.005 |
| 14.8499999999999 | 0.005 |
| 14.8599999999999 | 0.005 |
| 14.8699999999999 | 0.005 |
| 14.8799999999999 | 0.004 |
| 14.8899999999999 | 0.004 |
| 14.8999999999999 | 0.004 |
| 14.9099999999999 | 0.004 |
| 14.9199999999999 | 0.004 |
| 14.9299999999999 | 0.004 |
| 14.9399999999999 | 0.004 |
| 14.9499999999999 | 0.004 |
| 14.9599999999999 | 0.004 |
| 14.9699999999999 | 0.004 |
| 14.9799999999999 | 0.004 |
| 14.9899999999999 | 0.004 |
| 14.9999999999999 | 0.004 |
| 15.0099999999999 | 0.004 |
| 15.0199999999999 | 0.004 |
| 15.0299999999999 | 0.004 |
| 15.0399999999999 | 0.004 |
| 15.0499999999999 | 0.004 |
| 15.0599999999999 | 0.004 |
| 15.0699999999999 | 0.004 |
| 15.0799999999999 | 0.004 |
| 15.0899999999999 | 0.004 |
| 15.0999999999999 | 0.004 |
| 15.1099999999999 | 0.004 |
| 15.1199999999999 | 0.004 |
| 15.1299999999999 | 0.004 |
| 15.1399999999999 | 0.004 |
| 15.1499999999999 | 0.004 |
| 15.1599999999999 | 0.004 |
| 15.1699999999999 | 0.004 |
| 15.1799999999999 | 0.004 |
| 15.1899999999999 | 0.004 |
| 15.1999999999999 | 0.004 |
| 15.2099999999999 | 0.004 |
| 15.2199999999999 | 0.004 |
| 15.2299999999999 | 0.004 |
| 15.2399999999999 | 0.004 |
| 15.2499999999999 | 0.004 |
| 15.2599999999999 | 0.004 |
| 15.2699999999999 | 0.004 |
| 15.2799999999999 | 0.004 |
| 15.2899999999999 | 0.004 |
| 15.2999999999999 | 0.004 |
| 15.3099999999999 | 0.004 |
| 15.3199999999999 | 0.004 |
| 15.3299999999999 | 0.004 |
| 15.3399999999999 | 0.004 |
| 15.3499999999999 | 0.004 |
| 15.3599999999999 | 0.004 |
| 15.3699999999999 | 0.004 |
| 15.3799999999999 | 0.004 |
| 15.3899999999999 | 0.004 |
| 15.3999999999999 | 0.004 |
| 15.4099999999999 | 0.004 |
| 15.4199999999999 | 0.004 |
| 15.4299999999999 | 0.004 |
| 15.4399999999999 | 0.004 |
| 15.4499999999999 | 0.004 |
| 15.4599999999999 | 0.004 |
| 15.4699999999999 | 0.004 |
| 15.4799999999999 | 0.004 |
| 15.4899999999999 | 0.004 |
| 15.4999999999999 | 0.003 |
| 15.5099999999999 | 0.003 |
| 15.5199999999999 | 0.003 |
| 15.5299999999999 | 0.003 |
| 15.5399999999999 | 0.003 |
| 15.5499999999999 | 0.003 |
| 15.5599999999999 | 0.003 |
| 15.5699999999999 | 0.003 |
| 15.5799999999999 | 0.003 |
| 15.5899999999999 | 0.003 |
| 15.5999999999999 | 0.003 |
| 15.6099999999999 | 0.003 |
| 15.6199999999999 | 0.003 |
| 15.6299999999999 | 0.003 |
| 15.6399999999999 | 0.003 |
| 15.6499999999999 | 0.003 |
| 15.6599999999999 | 0.003 |
| 15.6699999999999 | 0.003 |
| 15.6799999999999 | 0.003 |
| 15.6899999999999 | 0.003 |
| 15.6999999999999 | 0.003 |
| 15.7099999999999 | 0.003 |
| 15.7199999999999 | 0.003 |
| 15.7299999999999 | 0.003 |
| 15.7399999999999 | 0.003 |
| 15.7499999999999 | 0.003 |
| 15.7599999999999 | 0.003 |
| 15.7699999999999 | 0.003 |
| 15.7799999999999 | 0.003 |
| 15.7899999999999 | 0.003 |
| 15.7999999999999 | 0.003 |
| 15.8099999999999 | 0.003 |
| 15.8199999999999 | 0.003 |
| 15.8299999999999 | 0.003 |
| 15.8399999999999 | 0.003 |
| 15.8499999999999 | 0.003 |
| 15.8599999999999 | 0.003 |
| 15.8699999999999 | 0.003 |
| 15.8799999999999 | 0.003 |
| 15.8899999999999 | 0.003 |
| 15.8999999999999 | 0.003 |
| 15.9099999999999 | 0.003 |
| 15.9199999999999 | 0.003 |
| 15.9299999999999 | 0.003 |
| 15.9399999999999 | 0.003 |
| 15.9499999999999 | 0.003 |
| 15.9599999999999 | 0.003 |
| 15.9699999999999 | 0.003 |
| 15.9799999999999 | 0.003 |
| 15.9899999999999 | 0.003 |
| 15.9999999999999 | 0.003 |
| 16.0099999999999 | 0.003 |
| 16.0199999999999 | 0.003 |
| 16.0299999999999 | 0.003 |
| 16.0399999999999 | 0.003 |
| 16.0499999999999 | 0.003 |
| 16.0599999999999 | 0.003 |
| 16.0699999999999 | 0.003 |
| 16.0799999999999 | 0.003 |
| 16.0899999999999 | 0.003 |
| 16.0999999999999 | 0.003 |
| 16.1099999999999 | 0.003 |
| 16.1199999999999 | 0.003 |
| 16.1299999999999 | 0.003 |
| 16.1399999999999 | 0.003 |
| 16.1499999999999 | 0.003 |
| 16.1599999999999 | 0.003 |
| 16.1699999999999 | 0.003 |
| 16.1799999999999 | 0.003 |
| 16.1899999999999 | 0.003 |
| 16.1999999999999 | 0.003 |
| 16.2099999999999 | 0.003 |
| 16.2199999999999 | 0.003 |
| 16.2299999999999 | 0.003 |
| 16.2399999999999 | 0.003 |
| 16.2499999999999 | 0.003 |
| 16.2599999999999 | 0.003 |
| 16.2699999999999 | 0.003 |
| 16.2799999999999 | 0.003 |
| 16.2899999999999 | 0.003 |
| 16.2999999999999 | 0.003 |
| 16.3099999999999 | 0.003 |
| 16.3199999999999 | 0.003 |
| 16.3299999999999 | 0.002 |
| 16.3399999999999 | 0.002 |
| 16.3499999999999 | 0.002 |
| 16.3599999999999 | 0.002 |
| 16.3699999999999 | 0.002 |
| 16.3799999999999 | 0.002 |
| 16.3899999999999 | 0.002 |
| 16.3999999999999 | 0.002 |
| 16.4099999999999 | 0.002 |
| 16.4199999999999 | 0.002 |
| 16.4299999999999 | 0.002 |
| 16.4399999999999 | 0.002 |
| 16.4499999999999 | 0.002 |
| 16.4599999999999 | 0.002 |
| 16.4699999999999 | 0.002 |
| 16.4799999999999 | 0.002 |
| 16.4899999999999 | 0.002 |
| 16.4999999999999 | 0.002 |
| 16.5099999999999 | 0.002 |
| 16.5199999999999 | 0.002 |
| 16.5299999999999 | 0.002 |
| 16.5399999999999 | 0.002 |
| 16.5499999999999 | 0.002 |
| 16.5599999999999 | 0.002 |
| 16.5699999999999 | 0.002 |
| 16.5799999999999 | 0.002 |
| 16.5899999999999 | 0.002 |
| 16.5999999999999 | 0.002 |
| 16.6099999999999 | 0.002 |
| 16.6199999999999 | 0.002 |
| 16.6299999999999 | 0.002 |
| 16.6399999999999 | 0.002 |
| 16.6499999999999 | 0.002 |
| 16.6599999999999 | 0.002 |
| 16.6699999999999 | 0.002 |
| 16.6799999999999 | 0.002 |
| 16.6899999999999 | 0.002 |
| 16.6999999999999 | 0.002 |
| 16.7099999999999 | 0.002 |
| 16.7199999999999 | 0.002 |
| 16.7299999999999 | 0.002 |
| 16.7399999999999 | 0.002 |
| 16.7499999999999 | 0.002 |
| 16.7599999999999 | 0.002 |
| 16.7699999999999 | 0.002 |
| 16.7799999999999 | 0.002 |
| 16.7899999999998 | 0.002 |
| 16.7999999999999 | 0.002 |
| 16.8099999999998 | 0.002 |
| 16.8199999999999 | 0.002 |
| 16.8299999999998 | 0.002 |
| 16.8399999999999 | 0.002 |
| 16.8499999999999 | 0.002 |
| 16.8599999999999 | 0.002 |
| 16.8699999999998 | 0.002 |
| 16.8799999999998 | 0.002 |
| 16.8899999999999 | 0.002 |
| 16.8999999999998 | 0.002 |
| 16.9099999999999 | 0.002 |
| 16.9199999999999 | 0.002 |
| 16.9299999999999 | 0.002 |
| 16.9399999999998 | 0.002 |
| 16.9499999999999 | 0.002 |
| 16.9599999999999 | 0.002 |
| 16.9699999999998 | 0.002 |
| 16.9799999999999 | 0.002 |
| 16.9899999999998 | 0.002 |
| 16.9999999999999 | 0.002 |
| 17.0099999999998 | 0.002 |
| 17.0199999999999 | 0.002 |
| 17.0299999999999 | 0.002 |
| 17.0399999999998 | 0.002 |
| 17.0499999999999 | 0.002 |
| 17.0599999999998 | 0.002 |
| 17.0699999999999 | 0.002 |
| 17.0799999999998 | 0.002 |
| 17.0899999999999 | 0.002 |
| 17.0999999999999 | 0.002 |
| 17.1099999999999 | 0.002 |
| 17.1199999999998 | 0.002 |
| 17.1299999999998 | 0.002 |
| 17.1399999999999 | 0.002 |
| 17.1499999999998 | 0.002 |
| 17.1599999999999 | 0.002 |
| 17.1699999999999 | 0.002 |
| 17.1799999999999 | 0.002 |
| 17.1899999999998 | 0.002 |
| 17.1999999999999 | 0.002 |
| 17.2099999999999 | 0.002 |
| 17.2199999999998 | 0.002 |
| 17.2299999999999 | 0.002 |
| 17.2399999999998 | 0.002 |
| 17.2499999999999 | 0.002 |
| 17.2599999999998 | 0.002 |
| 17.2699999999998 | 0.002 |
| 17.2799999999998 | 0.002 |
| 17.2899999999998 | 0.002 |
| 17.2999999999998 | 0.002 |
| 17.3099999999998 | 0.002 |
| 17.3199999999998 | 0.002 |
| 17.3299999999998 | 0.002 |
| 17.3399999999998 | 0.002 |
| 17.3499999999998 | 0.002 |
| 17.3599999999998 | 0.002 |
| 17.3699999999998 | 0.002 |
| 17.3799999999998 | 0.002 |
| 17.3899999999998 | 0.002 |
| 17.3999999999998 | 0.002 |
| 17.4099999999998 | 0.002 |
| 17.4199999999998 | 0.002 |
| 17.4299999999998 | 0.002 |
| 17.4399999999998 | 0.002 |
| 17.4499999999998 | 0.002 |
| 17.4599999999998 | 0.002 |
| 17.4699999999998 | 0.002 |
| 17.4799999999998 | 0.002 |
| 17.4899999999998 | 0.002 |
| 17.4999999999998 | 0.002 |
| 17.5099999999998 | 0.002 |
| 17.5199999999998 | 0.002 |
| 17.5299999999998 | 0.002 |
| 17.5399999999998 | 0.002 |
| 17.5499999999998 | 0.002 |
| 17.5599999999998 | 0.002 |
| 17.5699999999998 | 0.001 |
| 17.5799999999998 | 0.001 |
| 17.5899999999998 | 0.001 |
| 17.5999999999998 | 0.001 |
| 17.6099999999998 | 0.001 |
| 17.6199999999998 | 0.001 |
| 17.6299999999998 | 0.001 |
| 17.6399999999998 | 0.001 |
| 17.6499999999998 | 0.001 |
| 17.6599999999998 | 0.001 |
| 17.6699999999998 | 0.001 |
| 17.6799999999998 | 0.001 |
| 17.6899999999998 | 0.001 |
| 17.6999999999998 | 0.001 |
| 17.7099999999998 | 0.001 |
| 17.7199999999998 | 0.001 |
| 17.7299999999998 | 0.001 |
| 17.7399999999998 | 0.001 |
| 17.7499999999998 | 0.001 |
| 17.7599999999998 | 0.001 |
| 17.7699999999998 | 0.001 |
| 17.7799999999998 | 0.001 |
| 17.7899999999998 | 0.001 |
| 17.7999999999998 | 0.001 |
| 17.8099999999998 | 0.001 |
| 17.8199999999998 | 0.001 |
| 17.8299999999998 | 0.001 |
| 17.8399999999998 | 0.001 |
| 17.8499999999998 | 0.001 |
| 17.8599999999998 | 0.001 |
| 17.8699999999998 | 0.001 |
| 17.8799999999998 | 0.001 |
| 17.8899999999998 | 0.001 |
| 17.8999999999998 | 0.001 |
| 17.9099999999998 | 0.001 |
| 17.9199999999998 | 0.001 |
| 17.9299999999998 | 0.001 |
| 17.9399999999998 | 0.001 |
| 17.9499999999998 | 0.001 |
| 17.9599999999998 | 0.001 |
| 17.9699999999998 | 0.001 |
| 17.9799999999998 | 0.001 |
| 17.9899999999998 | 0.001 |
| 17.9999999999998 | 0.001 |
| 18.0099999999998 | 0.001 |
| 18.0199999999998 | 0.001 |
| 18.0299999999998 | 0.001 |
| 18.0399999999998 | 0.001 |
| 18.0499999999998 | 0.001 |
| 18.0599999999998 | 0.001 |
| 18.0699999999998 | 0.001 |
| 18.0799999999998 | 0.001 |
| 18.0899999999998 | 0.001 |
| 18.0999999999998 | 0.001 |
| 18.1099999999998 | 0.001 |
| 18.1199999999998 | 0.001 |
| 18.1299999999998 | 0.001 |
| 18.1399999999998 | 0.001 |
| 18.1499999999998 | 0.001 |
| 18.1599999999998 | 0.001 |
| 18.1699999999998 | 0.001 |
| 18.1799999999998 | 0.001 |
| 18.1899999999998 | 0.001 |
| 18.1999999999998 | 0.001 |
| 18.2099999999998 | 0.001 |
| 18.2199999999998 | 0.001 |
| 18.2299999999998 | 0.001 |
| 18.2399999999998 | 0.001 |
| 18.2499999999998 | 0.001 |
| 18.2599999999998 | 0.001 |
| 18.2699999999998 | 0.001 |
| 18.2799999999998 | 0.001 |
| 18.2899999999998 | 0.001 |
| 18.2999999999998 | 0.001 |
| 18.3099999999998 | 0.001 |
| 18.3199999999998 | 0.001 |
| 18.3299999999998 | 0.001 |
| 18.3399999999998 | 0.001 |
| 18.3499999999998 | 0.001 |
| 18.3599999999998 | 0.001 |
| 18.3699999999998 | 0.001 |
| 18.3799999999998 | 0.001 |
| 18.3899999999998 | 0.001 |
| 18.3999999999998 | 0.001 |
| 18.4099999999998 | 0.001 |
| 18.4199999999998 | 0.001 |
| 18.4299999999998 | 0.001 |
| 18.4399999999998 | 0.001 |
| 18.4499999999998 | 0.001 |
| 18.4599999999998 | 0.001 |
| 18.4699999999998 | 0.001 |
| 18.4799999999998 | 0.001 |
| 18.4899999999998 | 0.001 |
| 18.4999999999998 | 0.001 |
| 18.5099999999998 | 0.001 |
| 18.5199999999998 | 0.001 |
| 18.5299999999998 | 0.001 |
| 18.5399999999998 | 0.001 |
| 18.5499999999998 | 0.001 |
| 18.5599999999998 | 0.001 |
| 18.5699999999998 | 0.001 |
| 18.5799999999998 | 0.001 |
| 18.5899999999998 | 0.001 |
| 18.5999999999998 | 0.001 |
| 18.6099999999998 | 0.001 |
| 18.6199999999998 | 0.001 |
| 18.6299999999998 | 0.001 |
| 18.6399999999998 | 0.001 |
| 18.6499999999998 | 0.001 |
| 18.6599999999998 | 0.001 |
| 18.6699999999998 | 0.001 |
| 18.6799999999998 | 0.001 |
| 18.6899999999998 | 0.001 |
| 18.6999999999998 | 0.001 |
| 18.7099999999998 | 0.001 |
| 18.7199999999998 | 0.001 |
| 18.7299999999998 | 0.001 |
| 18.7399999999998 | 0.001 |
| 18.7499999999998 | 0.001 |
| 18.7599999999998 | 0.001 |
| 18.7699999999998 | 0.001 |
| 18.7799999999998 | 0.001 |
| 18.7899999999998 | 0.001 |
| 18.7999999999998 | 0.001 |
| 18.8099999999998 | 0.001 |
| 18.8199999999998 | 0.001 |
| 18.8299999999998 | 0.001 |
| 18.8399999999998 | 0.001 |
| 18.8499999999998 | 0.001 |
| 18.8599999999998 | 0.001 |
| 18.8699999999998 | 0.001 |
| 18.8799999999998 | 0.001 |
| 18.8899999999998 | 0.001 |
| 18.8999999999998 | 0.001 |
| 18.9099999999998 | 0.001 |
| 18.9199999999998 | 0.001 |
| 18.9299999999998 | 0.001 |
| 18.9399999999998 | 0.001 |
| 18.9499999999998 | 0.001 |
| 18.9599999999998 | 0.001 |
| 18.9699999999998 | 0.001 |
| 18.9799999999998 | 0.001 |
| 18.9899999999998 | 0.001 |
| 18.9999999999998 | 0.001 |
| 19.0099999999998 | 0.001 |
| 19.0199999999998 | 0.001 |
| 19.0299999999998 | 0.001 |
| 19.0399999999998 | 0.001 |
| 19.0499999999998 | 0.001 |
| 19.0599999999998 | 0.001 |
| 19.0699999999998 | 0.001 |
| 19.0799999999998 | 0.001 |
| 19.0899999999998 | 0.001 |
| 19.0999999999998 | 0.001 |
| 19.1099999999998 | 0.001 |
| 19.1199999999998 | 0.001 |
| 19.1299999999998 | 0.001 |
| 19.1399999999998 | 0.001 |
| 19.1499999999998 | 0.001 |
| 19.1599999999998 | 0.001 |
| 19.1699999999998 | 0.001 |
| 19.1799999999998 | 0.001 |
| 19.1899999999998 | 0.001 |
| 19.1999999999998 | 0.001 |
| 19.2099999999998 | 0.001 |
| 19.2199999999998 | 0.001 |
| 19.2299999999998 | 0.001 |
| 19.2399999999998 | 0.001 |
| 19.2499999999998 | 0.001 |
| 19.2599999999998 | 0.001 |
| 19.2699999999998 | 0.001 |
| 19.2799999999998 | 0.001 |
| 19.2899999999998 | 0.001 |
| 19.2999999999998 | 0.001 |
| 19.3099999999998 | 0.001 |
| 19.3199999999998 | 0.001 |
| 19.3299999999998 | 0.001 |
| 19.3399999999998 | 0.001 |
| 19.3499999999998 | 0.001 |
| 19.3599999999998 | 0.001 |
| 19.3699999999998 | 0.001 |
| 19.3799999999998 | 0.001 |
| 19.3899999999998 | 0.001 |
| 19.3999999999998 | 0.001 |
| 19.4099999999998 | 0.001 |
| 19.4199999999998 | 0.001 |
| 19.4299999999998 | 0.001 |
| 19.4399999999998 | 0.001 |
| 19.4499999999998 | 0.001 |
| 19.4599999999998 | 0.001 |
| 19.4699999999998 | 0.001 |
| 19.4799999999998 | 0.001 |
| 19.4899999999998 | 0.001 |
| 19.4999999999998 | 0.001 |
| 19.5099999999998 | 0.001 |
| 19.5199999999998 | 0.001 |
| 19.5299999999998 | 0.001 |
| 19.5399999999998 | 0.001 |
| 19.5499999999998 | 0.001 |
| 19.5599999999998 | 0.001 |
| 19.5699999999998 | 0.001 |
| 19.5799999999998 | 0.001 |
| 19.5899999999998 | 0.001 |
| 19.5999999999998 | 0.001 |
| 19.6099999999998 | 0.001 |
| 19.6199999999998 | 0.001 |
| 19.6299999999998 | 0.001 |
| 19.6399999999998 | 0.001 |
| 19.6499999999998 | 0.001 |
| 19.6599999999998 | 0.001 |
| 19.6699999999998 | 0.001 |
| 19.6799999999998 | 0.001 |
| 19.6899999999998 | 0.001 |
| 19.6999999999998 | 0.001 |
| 19.7099999999998 | 0.001 |
| 19.7199999999998 | 0.001 |
| 19.7299999999998 | 0.001 |
| 19.7399999999998 | 0.001 |
| 19.7499999999998 | 0.001 |
| 19.7599999999998 | 0.001 |
| 19.7699999999998 | 0.001 |
| 19.7799999999998 | 0.001 |
| 19.7899999999998 | 0.001 |
| 19.7999999999998 | 0.001 |
| 19.8099999999998 | 0.001 |
| 19.8199999999998 | 0.001 |
| 19.8299999999998 | 0.001 |
| 19.8399999999998 | 0.001 |
| 19.8499999999998 | 0.001 |
| 19.8599999999998 | 0.001 |
| 19.8699999999998 | 0.001 |
| 19.8799999999998 | 0.001 |
| 19.8899999999998 | 0.001 |
| 19.8999999999998 | 0.001 |
| 19.9099999999998 | 0.001 |
| 19.9199999999998 | 0.001 |
| 19.9299999999998 | 0.001 |
| 19.9399999999998 | 0.001 |
| 19.9499999999998 | 0.001 |
| 19.9599999999998 | 0.001 |
| 19.9699999999998 | 0.001 |
| 19.9799999999998 | 0.001 |
| 19.9899999999998 | 0.001 |
| 19.9999999999998 | 0.001 |